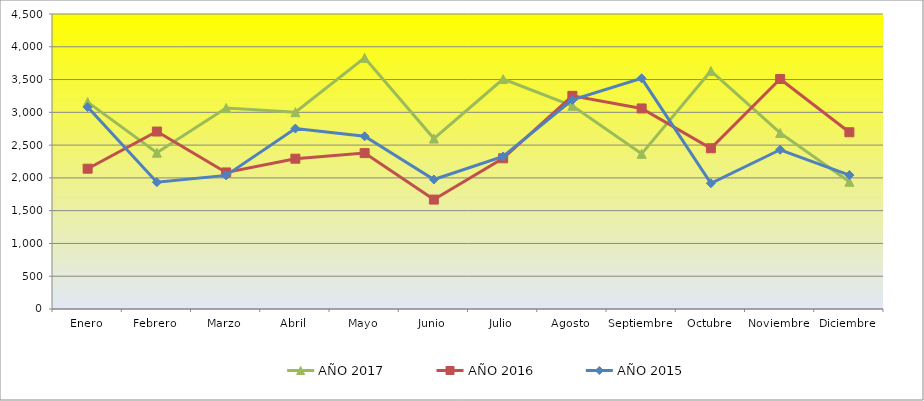
| Category | AÑO 2017 | AÑO 2016 | AÑO 2015 |
|---|---|---|---|
| Enero | 3155.676 | 2140 | 3080 |
| Febrero | 2383.784 | 2707 | 1935 |
| Marzo | 3064.865 | 2083 | 2038 |
| Abril | 3002.432 | 2293 | 2752 |
| Mayo | 3831.081 | 2378 | 2634 |
| Junio | 2599.459 | 1669 | 1975 |
| Julio | 3507.568 | 2299 | 2327 |
| Agosto | 3098.919 | 3252 | 3190 |
| Septiembre | 2366.757 | 3059 | 3519 |
| Octubre | 3630.789 | 2452 | 1918 |
| Noviembre | 2685.789 | 3508 | 2429 |
| Diciembre | 1941.081 | 2696 | 2043 |